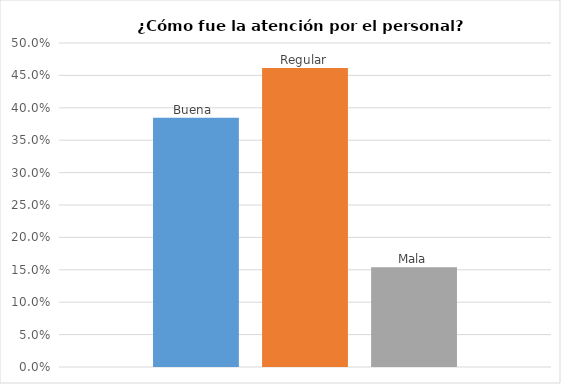
| Category | Buena  | Regular | Mala |
|---|---|---|---|
| 0 | 0.385 | 0.462 | 0.154 |